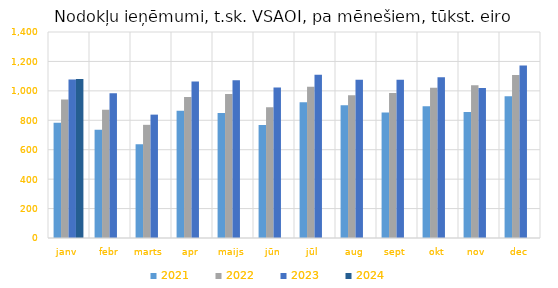
| Category | 2021 | 2022 | 2023 | 2024 |
|---|---|---|---|---|
| janv | 782986.001 | 941791.936 | 1077162.761 | 1080454.102 |
| febr | 734852.065 | 870814.989 | 983504.244 | 0 |
| marts | 637891.51 | 769054.685 | 838446.19 | 0 |
| apr | 864350.424 | 957835.152 | 1063867.001 | 0 |
| maijs | 850252.991 | 978678.559 | 1071795.241 | 0 |
| jūn | 768738.388 | 888916.233 | 1023214.676 | 0 |
| jūl | 922262.256 | 1027456.888 | 1108668.131 | 0 |
| aug | 901674.184 | 969994.081 | 1074853.308 | 0 |
| sept | 852725.586 | 985435.904 | 1074818.769 | 0 |
| okt | 895873.595 | 1021662.514 | 1092402.095 | 0 |
| nov | 856461.1 | 1038227.674 | 1019073.949 | 0 |
| dec | 962936.043 | 1107409.079 | 1172609.23 | 0 |